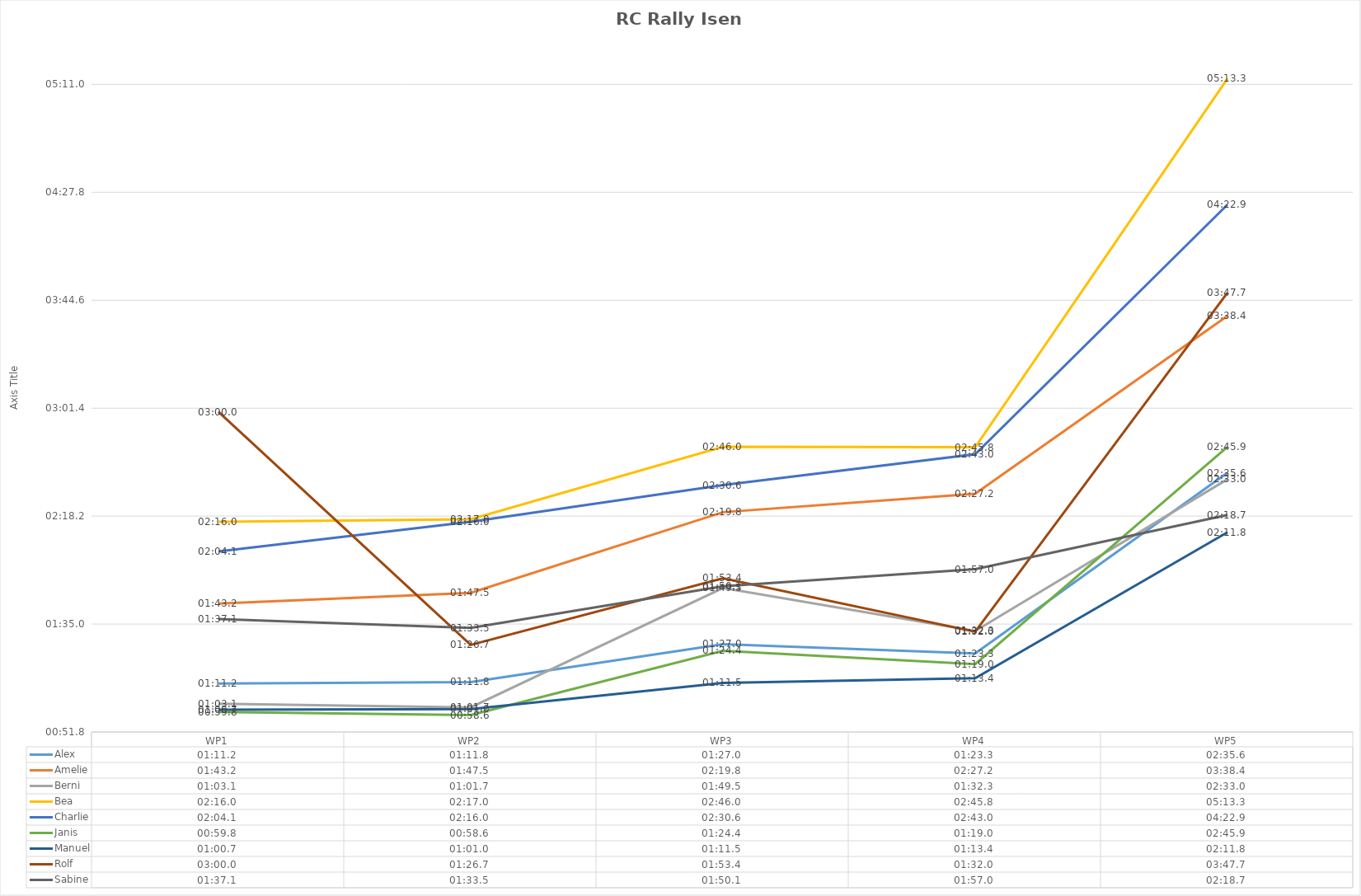
| Category | Alex | Amelie | Berni | Bea | Charlie | Janis | Manuel | Rolf | Sabine |
|---|---|---|---|---|---|---|---|---|---|
| WP1 | 0.001 | 0.001 | 0.001 | 0.002 | 0.001 | 0.001 | 0.001 | 0.002 | 0.001 |
| WP2 | 0.001 | 0.001 | 0.001 | 0.002 | 0.002 | 0.001 | 0.001 | 0.001 | 0.001 |
| WP3 | 0.001 | 0.002 | 0.001 | 0.002 | 0.002 | 0.001 | 0.001 | 0.001 | 0.001 |
| WP4 | 0.001 | 0.002 | 0.001 | 0.002 | 0.002 | 0.001 | 0.001 | 0.001 | 0.001 |
| WP5 | 0.002 | 0.003 | 0.002 | 0.004 | 0.003 | 0.002 | 0.002 | 0.003 | 0.002 |